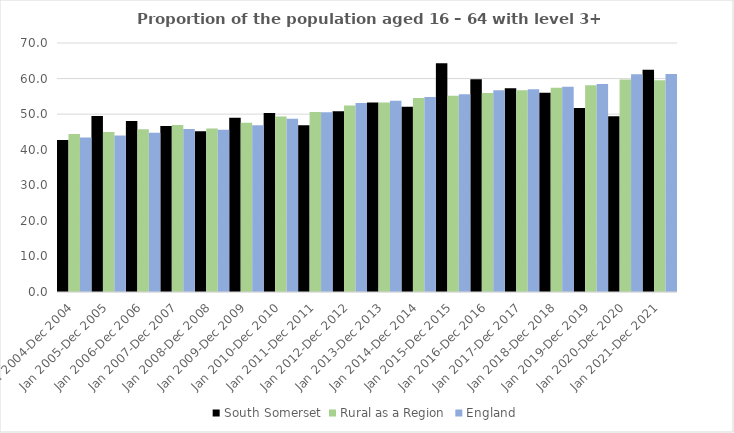
| Category | South Somerset | Rural as a Region | England |
|---|---|---|---|
| Jan 2004-Dec 2004 | 42.7 | 44.405 | 43.4 |
| Jan 2005-Dec 2005 | 49.5 | 44.973 | 44 |
| Jan 2006-Dec 2006 | 48.1 | 45.774 | 44.8 |
| Jan 2007-Dec 2007 | 46.7 | 46.968 | 45.8 |
| Jan 2008-Dec 2008 | 45.2 | 45.964 | 45.6 |
| Jan 2009-Dec 2009 | 49 | 47.59 | 46.9 |
| Jan 2010-Dec 2010 | 50.3 | 49.362 | 48.7 |
| Jan 2011-Dec 2011 | 46.9 | 50.602 | 50.5 |
| Jan 2012-Dec 2012 | 50.8 | 52.439 | 53.1 |
| Jan 2013-Dec 2013 | 53.3 | 53.276 | 53.8 |
| Jan 2014-Dec 2014 | 52.1 | 54.57 | 54.8 |
| Jan 2015-Dec 2015 | 64.3 | 55.16 | 55.6 |
| Jan 2016-Dec 2016 | 59.8 | 55.941 | 56.7 |
| Jan 2017-Dec 2017 | 57.3 | 56.689 | 57 |
| Jan 2018-Dec 2018 | 56 | 57.389 | 57.7 |
| Jan 2019-Dec 2019 | 51.7 | 58.147 | 58.5 |
| Jan 2020-Dec 2020 | 49.4 | 59.771 | 61.2 |
| Jan 2021-Dec 2021 | 62.5 | 59.54 | 61.3 |